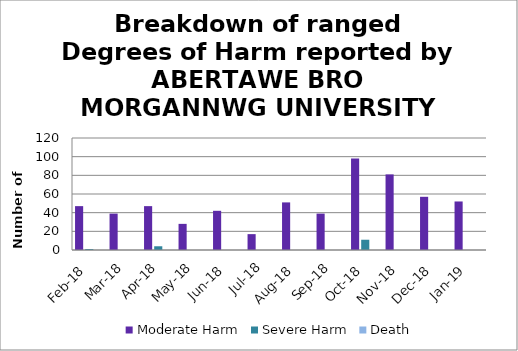
| Category | Moderate Harm | Severe Harm | Death |
|---|---|---|---|
| Feb-18 | 47 | 1 | 0 |
| Mar-18 | 39 | 0 | 0 |
| Apr-18 | 47 | 4 | 0 |
| May-18 | 28 | 0 | 0 |
| Jun-18 | 42 | 0 | 0 |
| Jul-18 | 17 | 0 | 0 |
| Aug-18 | 51 | 0 | 0 |
| Sep-18 | 39 | 0 | 0 |
| Oct-18 | 98 | 11 | 0 |
| Nov-18 | 81 | 0 | 0 |
| Dec-18 | 57 | 0 | 0 |
| Jan-19 | 52 | 0 | 0 |